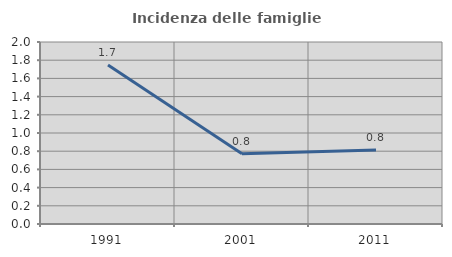
| Category | Incidenza delle famiglie numerose |
|---|---|
| 1991.0 | 1.747 |
| 2001.0 | 0.772 |
| 2011.0 | 0.814 |